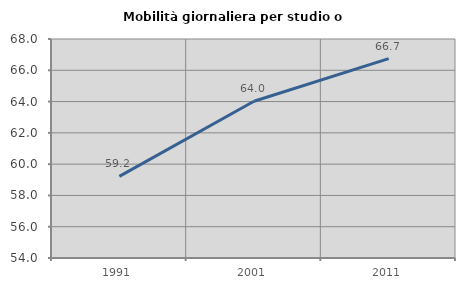
| Category | Mobilità giornaliera per studio o lavoro |
|---|---|
| 1991.0 | 59.218 |
| 2001.0 | 64.018 |
| 2011.0 | 66.743 |